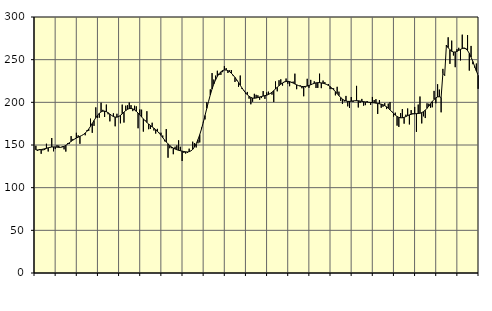
| Category | Piggar | Series 1 |
|---|---|---|
| nan | 149.1 | 144.2 |
| 1.0 | 143.1 | 144.2 |
| 1.0 | 145.3 | 144.4 |
| 1.0 | 139.7 | 144.72 |
| 1.0 | 143.7 | 145.1 |
| 1.0 | 144.1 | 145.56 |
| 1.0 | 151.5 | 146.1 |
| 1.0 | 142.4 | 146.74 |
| 1.0 | 147 | 147.3 |
| 1.0 | 158.2 | 147.66 |
| 1.0 | 142.6 | 147.77 |
| 1.0 | 145.2 | 147.68 |
| nan | 149.8 | 147.46 |
| 2.0 | 149.3 | 147.24 |
| 2.0 | 147 | 147.25 |
| 2.0 | 148.5 | 147.62 |
| 2.0 | 144.9 | 148.42 |
| 2.0 | 142.3 | 149.6 |
| 2.0 | 152.1 | 151.05 |
| 2.0 | 151.3 | 152.65 |
| 2.0 | 160.4 | 154.23 |
| 2.0 | 157.1 | 155.7 |
| 2.0 | 156.8 | 157.04 |
| 2.0 | 164.3 | 158.21 |
| nan | 161.3 | 159.2 |
| 3.0 | 151.4 | 160.14 |
| 3.0 | 161.2 | 161.12 |
| 3.0 | 162.5 | 162.33 |
| 3.0 | 161.4 | 163.97 |
| 3.0 | 167.3 | 166.14 |
| 3.0 | 166.6 | 168.78 |
| 3.0 | 180.9 | 171.86 |
| 3.0 | 164.3 | 175.22 |
| 3.0 | 172.4 | 178.63 |
| 3.0 | 194.1 | 181.92 |
| 3.0 | 181.7 | 184.84 |
| nan | 182 | 187.16 |
| 4.0 | 199.6 | 188.81 |
| 4.0 | 191.2 | 189.66 |
| 4.0 | 182.8 | 189.71 |
| 4.0 | 197.4 | 189.04 |
| 4.0 | 186 | 187.8 |
| 4.0 | 177.7 | 186.24 |
| 4.0 | 184.7 | 184.66 |
| 4.0 | 187.1 | 183.38 |
| 4.0 | 171.9 | 182.69 |
| 4.0 | 186.6 | 182.64 |
| 4.0 | 182.8 | 183.33 |
| nan | 175.4 | 184.71 |
| 5.0 | 197.3 | 186.5 |
| 5.0 | 176.3 | 188.46 |
| 5.0 | 196.1 | 190.36 |
| 5.0 | 196.6 | 191.83 |
| 5.0 | 199.8 | 192.67 |
| 5.0 | 196.7 | 192.83 |
| 5.0 | 189.7 | 192.31 |
| 5.0 | 196 | 191.13 |
| 5.0 | 195.3 | 189.45 |
| 5.0 | 169.6 | 187.43 |
| 5.0 | 191.7 | 185.19 |
| nan | 191.4 | 182.88 |
| 6.0 | 165.7 | 180.61 |
| 6.0 | 179.1 | 178.46 |
| 6.0 | 189.6 | 176.44 |
| 6.0 | 168.5 | 174.57 |
| 6.0 | 168.8 | 172.86 |
| 6.0 | 176.1 | 171.27 |
| 6.0 | 167 | 169.69 |
| 6.0 | 163.4 | 168.01 |
| 6.0 | 168.9 | 166.08 |
| 6.0 | 164.3 | 163.85 |
| 6.0 | 164.4 | 161.34 |
| nan | 161.1 | 158.66 |
| 7.0 | 154.4 | 156.01 |
| 7.0 | 168.7 | 153.55 |
| 7.0 | 135.1 | 151.31 |
| 7.0 | 146.2 | 149.32 |
| 7.0 | 146.3 | 147.69 |
| 7.0 | 139.2 | 146.37 |
| 7.0 | 148 | 145.29 |
| 7.0 | 149.6 | 144.45 |
| 7.0 | 155.5 | 143.79 |
| 7.0 | 147.9 | 143.27 |
| 7.0 | 131.3 | 142.8 |
| nan | 140.8 | 142.36 |
| 8.0 | 140 | 142.01 |
| 8.0 | 140.7 | 141.87 |
| 8.0 | 145.7 | 142.13 |
| 8.0 | 143.3 | 143.07 |
| 8.0 | 153.9 | 144.85 |
| 8.0 | 152.2 | 147.62 |
| 8.0 | 147.1 | 151.45 |
| 8.0 | 152 | 156.29 |
| 8.0 | 153 | 162.12 |
| 8.0 | 170.4 | 168.87 |
| 8.0 | 177.2 | 176.46 |
| nan | 180 | 184.62 |
| 9.0 | 200.1 | 192.95 |
| 9.0 | 201.1 | 201.11 |
| 9.0 | 215.2 | 208.76 |
| 9.0 | 234.3 | 215.61 |
| 9.0 | 226.7 | 221.53 |
| 9.0 | 231.3 | 226.45 |
| 9.0 | 237 | 230.43 |
| 9.0 | 232.1 | 233.56 |
| 9.0 | 232.2 | 235.83 |
| 9.0 | 235.4 | 237.27 |
| 9.0 | 242.5 | 237.91 |
| nan | 240.1 | 237.85 |
| 10.0 | 234.4 | 237.13 |
| 10.0 | 237.6 | 235.79 |
| 10.0 | 237.8 | 233.98 |
| 10.0 | 230.8 | 231.78 |
| 10.0 | 223.9 | 229.23 |
| 10.0 | 225.6 | 226.34 |
| 10.0 | 218.2 | 223.2 |
| 10.0 | 231.4 | 219.97 |
| 10.0 | 215.6 | 216.82 |
| 10.0 | 213.3 | 213.85 |
| 10.0 | 210.1 | 211.18 |
| nan | 212.2 | 208.89 |
| 11.0 | 204.3 | 207.07 |
| 11.0 | 197.7 | 205.77 |
| 11.0 | 200.7 | 205 |
| 11.0 | 210 | 204.81 |
| 11.0 | 208.8 | 205.05 |
| 11.0 | 208.2 | 205.61 |
| 11.0 | 203 | 206.25 |
| 11.0 | 205 | 206.84 |
| 11.0 | 213.2 | 207.33 |
| 11.0 | 204 | 207.82 |
| 11.0 | 211.6 | 208.41 |
| nan | 212.5 | 209.21 |
| 12.0 | 210.7 | 210.33 |
| 12.0 | 209 | 211.86 |
| 12.0 | 200.3 | 213.72 |
| 12.0 | 224.5 | 215.71 |
| 12.0 | 212.9 | 217.68 |
| 12.0 | 225.9 | 219.56 |
| 12.0 | 227 | 221.26 |
| 12.0 | 219.6 | 222.69 |
| 12.0 | 224.2 | 223.78 |
| 12.0 | 227.9 | 224.45 |
| 12.0 | 221.8 | 224.62 |
| nan | 218.9 | 224.3 |
| 13.0 | 222.8 | 223.58 |
| 13.0 | 224.3 | 222.6 |
| 13.0 | 233.6 | 221.53 |
| 13.0 | 215.4 | 220.52 |
| 13.0 | 219.5 | 219.66 |
| 13.0 | 219.9 | 219 |
| 13.0 | 216.5 | 218.58 |
| 13.0 | 207.1 | 218.45 |
| 13.0 | 217.5 | 218.63 |
| 13.0 | 227.6 | 219.09 |
| 13.0 | 217 | 219.76 |
| nan | 226.3 | 220.6 |
| 14.0 | 221.5 | 221.5 |
| 14.0 | 224.6 | 222.27 |
| 14.0 | 216.8 | 222.83 |
| 14.0 | 216.9 | 223.08 |
| 14.0 | 233.6 | 223.06 |
| 14.0 | 216.6 | 222.78 |
| 14.0 | 225.5 | 222.34 |
| 14.0 | 223.7 | 221.76 |
| 14.0 | 220.7 | 220.96 |
| 14.0 | 221.5 | 219.86 |
| 14.0 | 215.5 | 218.46 |
| nan | 215.5 | 216.74 |
| 15.0 | 216.4 | 214.73 |
| 15.0 | 208.2 | 212.52 |
| 15.0 | 218.2 | 210.14 |
| 15.0 | 212.5 | 207.79 |
| 15.0 | 201.7 | 205.64 |
| 15.0 | 198.2 | 203.79 |
| 15.0 | 201 | 202.4 |
| 15.0 | 207.5 | 201.52 |
| 15.0 | 195.3 | 201.1 |
| 15.0 | 193.4 | 201.07 |
| 15.0 | 206.2 | 201.31 |
| nan | 200.4 | 201.64 |
| 16.0 | 202 | 201.89 |
| 16.0 | 219.3 | 201.94 |
| 16.0 | 194 | 201.82 |
| 16.0 | 199.3 | 201.52 |
| 16.0 | 204 | 201.15 |
| 16.0 | 196.1 | 200.81 |
| 16.0 | 196.7 | 200.5 |
| 16.0 | 201.5 | 200.24 |
| 16.0 | 200.1 | 200.02 |
| 16.0 | 197 | 199.84 |
| 16.0 | 206.3 | 199.64 |
| nan | 202.7 | 199.39 |
| 17.0 | 203.7 | 199.08 |
| 17.0 | 186.4 | 198.71 |
| 17.0 | 202.7 | 198.3 |
| 17.0 | 193.6 | 197.83 |
| 17.0 | 194.8 | 197.1 |
| 17.0 | 199.1 | 196.09 |
| 17.0 | 192.1 | 194.77 |
| 17.0 | 198.5 | 193.1 |
| 17.0 | 200.4 | 191.18 |
| 17.0 | 189.8 | 189.11 |
| 17.0 | 183.3 | 187.01 |
| nan | 187.9 | 185.01 |
| 18.0 | 172.7 | 183.43 |
| 18.0 | 171.2 | 182.39 |
| 18.0 | 187.4 | 181.87 |
| 18.0 | 192.1 | 181.88 |
| 18.0 | 175 | 182.41 |
| 18.0 | 185.5 | 183.33 |
| 18.0 | 192.8 | 184.38 |
| 18.0 | 174.1 | 185.32 |
| 18.0 | 190.9 | 185.99 |
| 18.0 | 187.4 | 186.41 |
| 18.0 | 194.6 | 186.61 |
| nan | 165.4 | 186.74 |
| 19.0 | 197.4 | 186.89 |
| 19.0 | 206.8 | 187.22 |
| 19.0 | 175.3 | 187.93 |
| 19.0 | 183.6 | 189.09 |
| 19.0 | 181.6 | 190.78 |
| 19.0 | 198.9 | 193 |
| 19.0 | 198.4 | 195.54 |
| 19.0 | 193.7 | 198.31 |
| 19.0 | 194.2 | 201.04 |
| 19.0 | 213.4 | 203.41 |
| 19.0 | 198.9 | 205.27 |
| nan | 221.2 | 206.38 |
| 20.0 | 214.9 | 206.56 |
| 20.0 | 188.3 | 205.7 |
| 20.0 | 239.2 | 234.01 |
| 20.0 | 232.1 | 231.57 |
| 20.0 | 265.7 | 266.93 |
| 20.0 | 276.2 | 264.09 |
| 20.0 | 245.1 | 261.63 |
| 20.0 | 272.3 | 259.86 |
| 20.0 | 254.9 | 258.99 |
| 20.0 | 241.2 | 259.01 |
| 20.0 | 262.3 | 259.68 |
| nan | 263.9 | 260.83 |
| 21.0 | 249.1 | 262.07 |
| 21.0 | 279.3 | 263.04 |
| 21.0 | 264.1 | 263.39 |
| 21.0 | 263.7 | 262.67 |
| 21.0 | 278.8 | 260.68 |
| 21.0 | 237.2 | 257.4 |
| 21.0 | 266.1 | 253 |
| 21.0 | 244.7 | 247.84 |
| 21.0 | 240.8 | 242.27 |
| 21.0 | 245.5 | 236.78 |
| 21.0 | 215.8 | 231.75 |